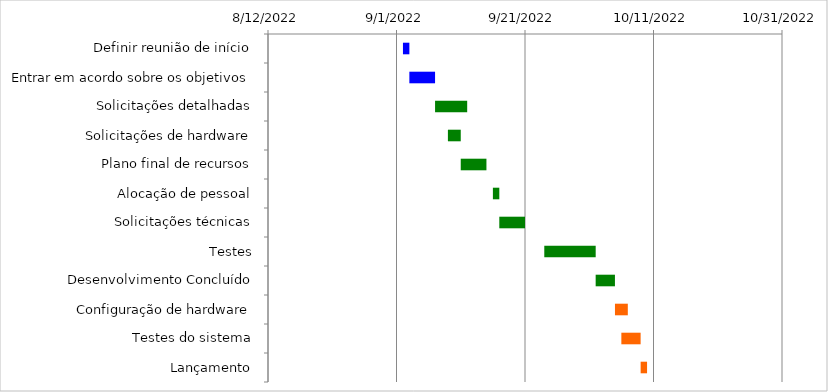
| Category | Início | Dias |
|---|---|---|
| Definir reunião de início | 9/2/22 | 1 |
| Entrar em acordo sobre os objetivos | 9/3/22 | 4 |
| Solicitações detalhadas | 9/7/22 | 5 |
| Solicitações de hardware | 9/9/22 | 2 |
| Plano final de recursos | 9/11/22 | 4 |
| Alocação de pessoal | 9/16/22 | 1 |
| Solicitações técnicas | 9/17/22 | 4 |
| Testes | 9/24/22 | 8 |
| Desenvolvimento Concluído | 10/2/22 | 3 |
| Configuração de hardware | 10/5/22 | 2 |
| Testes do sistema | 10/6/22 | 3 |
| Lançamento | 10/9/22 | 1 |